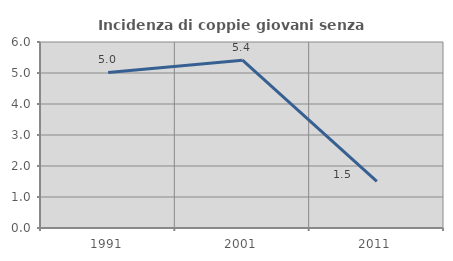
| Category | Incidenza di coppie giovani senza figli |
|---|---|
| 1991.0 | 5.018 |
| 2001.0 | 5.415 |
| 2011.0 | 1.505 |